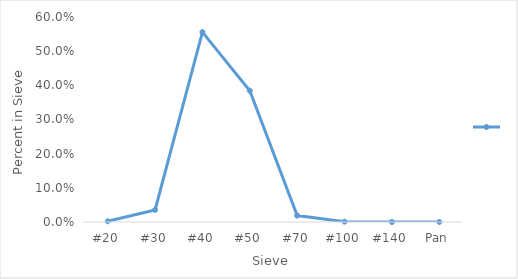
| Category | Series 0 |
|---|---|
| #20 | 0.002 |
| #30 | 0.035 |
| #40 | 0.556 |
| #50 | 0.384 |
| #70 | 0.019 |
| #100 | 0.001 |
| #140 | 0 |
| Pan | 0 |